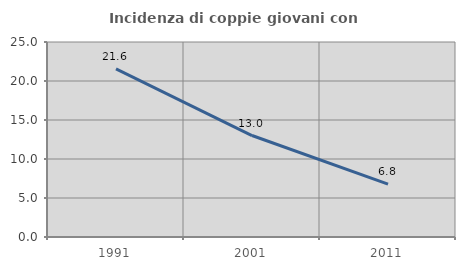
| Category | Incidenza di coppie giovani con figli |
|---|---|
| 1991.0 | 21.557 |
| 2001.0 | 13.008 |
| 2011.0 | 6.786 |